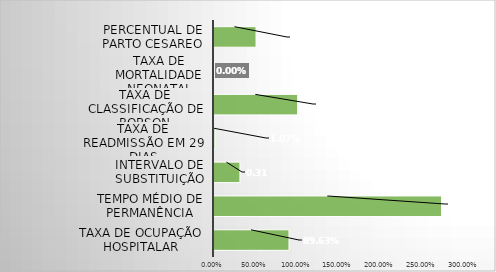
| Category | Series 0 |
|---|---|
| Taxa de Ocupação Hospitalar | 0.896 |
| Tempo Médio de permanência | 2.72 |
| Intervalo de substituição | 0.31 |
| Taxa de readmissão em 29 dias | 0.011 |
| Taxa de classificação de Robson | 1 |
| Taxa de mortalidade neonatal | 0 |
| Percentual de parto cesareo | 0.502 |